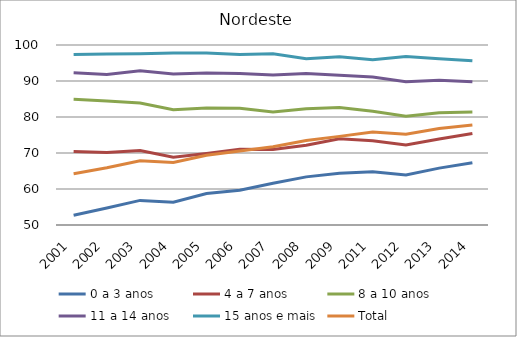
| Category | 0 a 3 anos | 4 a 7 anos | 8 a 10 anos | 11 a 14 anos | 15 anos e mais | Total |
|---|---|---|---|---|---|---|
| 2001.0 | 52.7 | 70.4 | 84.9 | 92.27 | 97.36 | 64.23 |
| 2002.0 | 54.7 | 70.11 | 84.47 | 91.83 | 97.5 | 65.92 |
| 2003.0 | 56.83 | 70.72 | 83.86 | 92.86 | 97.56 | 67.85 |
| 2004.0 | 56.3 | 68.83 | 82 | 91.97 | 97.79 | 67.39 |
| 2005.0 | 58.76 | 69.85 | 82.47 | 92.24 | 97.81 | 69.35 |
| 2006.0 | 59.65 | 71.04 | 82.4 | 92.06 | 97.35 | 70.57 |
| 2007.0 | 61.58 | 70.95 | 81.37 | 91.65 | 97.58 | 71.71 |
| 2008.0 | 63.37 | 72.16 | 82.32 | 92.05 | 96.19 | 73.49 |
| 2009.0 | 64.38 | 73.97 | 82.64 | 91.6 | 96.71 | 74.62 |
| 2011.0 | 64.8 | 73.4 | 81.6 | 91.1 | 95.9 | 75.8 |
| 2012.0 | 63.9 | 72.2 | 80.2 | 89.8 | 96.8 | 75.2 |
| 2013.0 | 65.8 | 73.9 | 81.2 | 90.2 | 96.2 | 76.8 |
| 2014.0 | 67.3 | 75.4 | 81.4 | 89.8 | 95.6 | 77.8 |